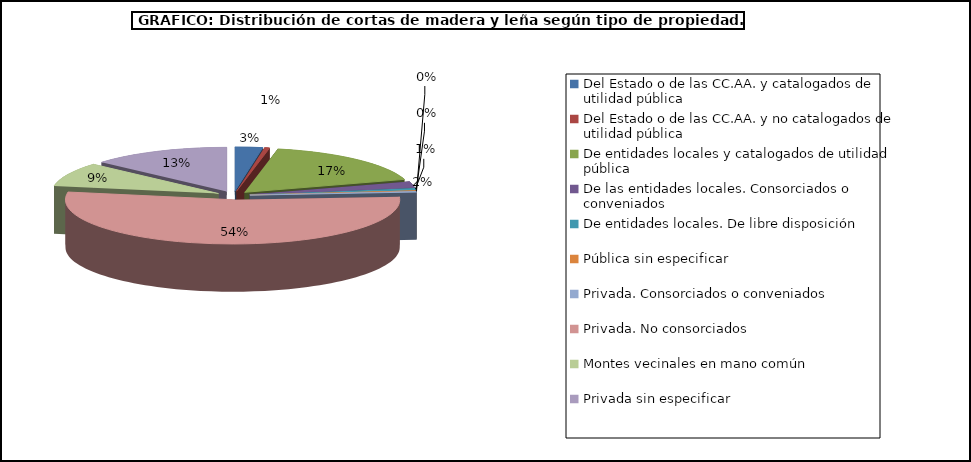
| Category | Series 0 |
|---|---|
| Del Estado o de las CC.AA. y catalogados de utilidad pública | 401814.675 |
| Del Estado o de las CC.AA. y no catalogados de utilidad pública | 77302.25 |
| De entidades locales y catalogados de utilidad pública | 2574104.84 |
| De las entidades locales. Consorciados o conveniados | 331660.355 |
| De entidades locales. De libre disposición | 114990.99 |
| Pública sin especificar | 42316.67 |
| Privada. Consorciados o conveniados | 54991.369 |
| Privada. No consorciados | 8116834.59 |
| Montes vecinales en mano común | 1318160 |
| Privada sin especificar | 2027598.76 |